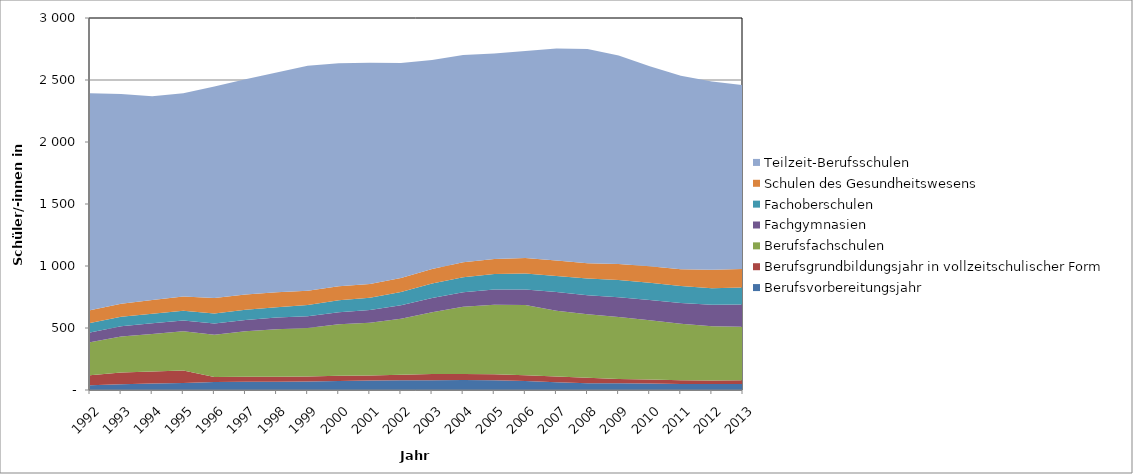
| Category | Berufsvorbereitungsjahr  | Berufsgrundbildungsjahr in vollzeitschulischer Form  | Berufsfachschulen  | Fachgymnasien | Fachoberschulen | Schulen des Gesundheitswesens | Teilzeit-Berufsschulen  |
|---|---|---|---|---|---|---|---|
| 1992.0 | 39242 | 80522 | 266084 | 78726 | 75461 | 104116 | 1749781 |
| 1993.0 | 46464 | 95223 | 289793 | 81705 | 76859 | 106214 | 1690510 |
| 1994.0 | 51734 | 98106 | 301861 | 85943 | 77999 | 109623 | 1643513 |
| 1995.0 | 55512 | 101234 | 316853 | 87395 | 78329 | 114962 | 1637906 |
| 1996.0 | 65198 | 39966 | 340682 | 90179 | 81679 | 124027 | 1706829 |
| 1997.0 | 66364 | 40229 | 366648 | 91999 | 82336 | 122365 | 1736342 |
| 1998.0 | 66806 | 40856 | 383231 | 93092 | 84230 | 120847 | 1772113 |
| 1999.0 | 68606 | 39677 | 391943 | 94775 | 89903 | 115791 | 1814594 |
| 2000.0 | 72787 | 41236 | 415310 | 98088 | 96406 | 112951 | 1797318 |
| 2001.0 | 75810 | 40495 | 425371 | 102596 | 99442 | 111778 | 1784426 |
| 2002.0 | 79496 | 43204 | 452250 | 108915 | 106143 | 113374 | 1733233 |
| 2003.0 | 79284 | 49216 | 498275 | 114513 | 117006 | 117620 | 1685278 |
| 2004.0 | 80559 | 48079 | 541830 | 117480 | 121658 | 119659 | 1672009 |
| 2005.0 | 77667 | 50137 | 560656 | 121189 | 125957 | 121002 | 1656343 |
| 2006.0 | 71907 | 47937 | 566219 | 124085 | 130253 | 123419 | 1669362 |
| 2007.0 | 62077 | 46031 | 530272 | 151854 | 129802 | 123802 | 1709936 |
| 2008.0 | 55302 | 44358 | 510855 | 154074 | 134303 | 124260 | 1726703 |
| 2009.0 | 54716 | 34328 | 499524 | 158876 | 140228 | 128200 | 1681641 |
| 2010.0 | 51811 | 32478 | 478426 | 163294 | 139808 | 132030 | 1613579 |
| 2011.0 | 48941 | 29622 | 455212 | 168359 | 137447 | 134828 | 1558964 |
| 2012.0 | 48810 | 28217 | 436948 | 172879 | 134151 | 148558 | 1519244 |
| 2013.0 | 49230 | 28748 | 431200 | 180712 | 136658 | 149619 | 1482022 |